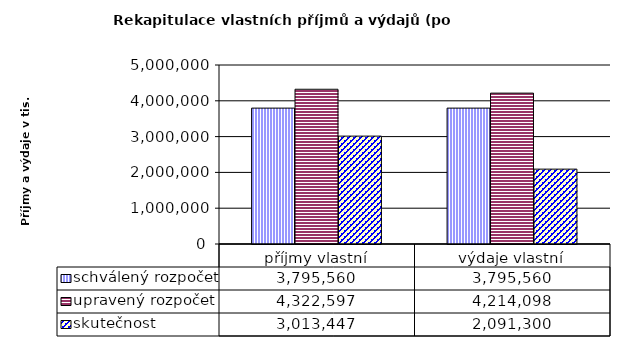
| Category | schválený rozpočet | upravený rozpočet | skutečnost |
|---|---|---|---|
| příjmy vlastní | 3795560 | 4322597 | 3013447 |
| výdaje vlastní | 3795560 | 4214098 | 2091300 |